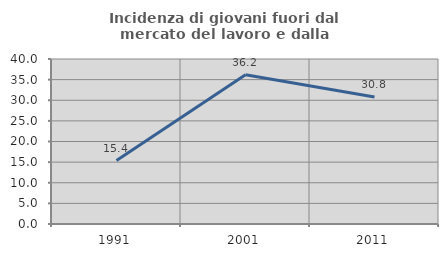
| Category | Incidenza di giovani fuori dal mercato del lavoro e dalla formazione  |
|---|---|
| 1991.0 | 15.385 |
| 2001.0 | 36.17 |
| 2011.0 | 30.769 |